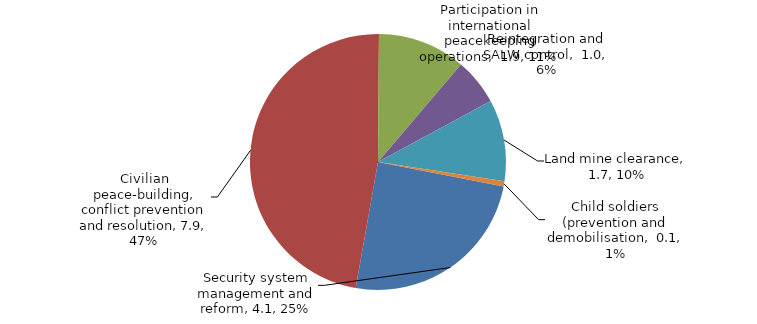
| Category | Series 0 |
|---|---|
| Security system management and reform | 4.127 |
| Civilian peace-building, conflict prevention and resolution | 7.897 |
| Participation in international peacekeeping operations | 1.852 |
| Reintegration and SALW control | 0.982 |
| Land mine clearance | 1.719 |
| Child soldiers  | 0.107 |